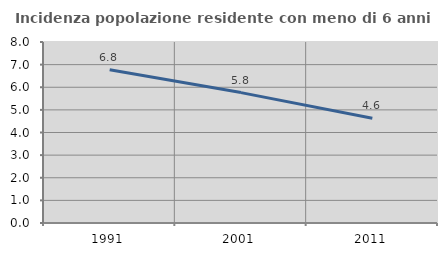
| Category | Incidenza popolazione residente con meno di 6 anni |
|---|---|
| 1991.0 | 6.776 |
| 2001.0 | 5.763 |
| 2011.0 | 4.634 |